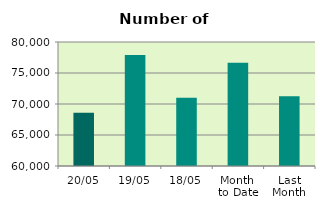
| Category | Series 0 |
|---|---|
| 20/05 | 68586 |
| 19/05 | 77896 |
| 18/05 | 71008 |
| Month 
to Date | 76656.154 |
| Last
Month | 71251.4 |